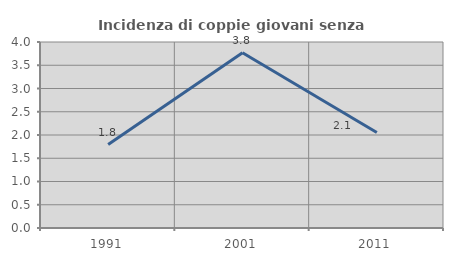
| Category | Incidenza di coppie giovani senza figli |
|---|---|
| 1991.0 | 1.795 |
| 2001.0 | 3.768 |
| 2011.0 | 2.055 |